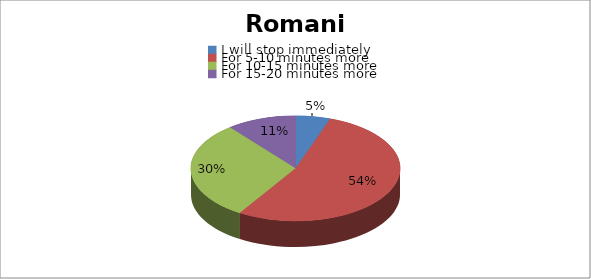
| Category | Series 0 |
|---|---|
| I will stop immediately | 6 |
| For 5-10 minutes more | 60 |
| For 10-15 minutes more | 34 |
| For 15-20 minutes more  | 12 |